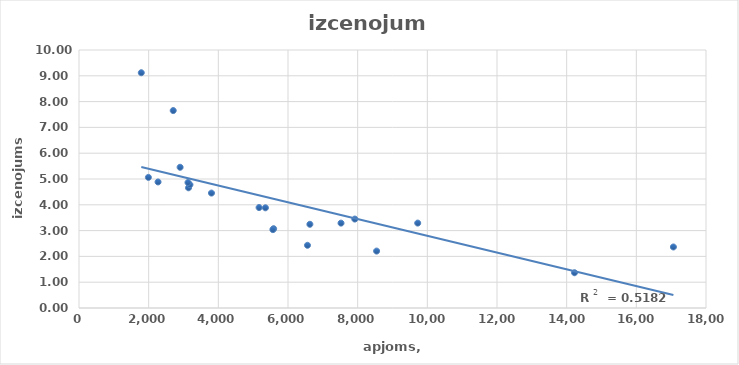
| Category | izcenojums |
|---|---|
| 5352.0 | 3.884 |
| 3144.0 | 4.659 |
| 17064.0 | 2.365 |
| 5587.0 | 3.073 |
| 2705.0 | 7.652 |
| 9724.0 | 3.291 |
| 3185.0 | 4.78 |
| 2269.0 | 4.885 |
| 1992.0 | 5.062 |
| 14225.0 | 1.367 |
| 6559.0 | 2.43 |
| 8544.0 | 2.206 |
| 5170.00229999999 | 3.893 |
| 2903.0 | 5.454 |
| 7917.5484 | 3.447 |
| 6628.0 | 3.244 |
| 1788.0 | 9.119 |
| 7522.243 | 3.29 |
| 3129.0 | 4.863 |
| 3803.0 | 4.454 |
| 5565.794 | 3.038 |